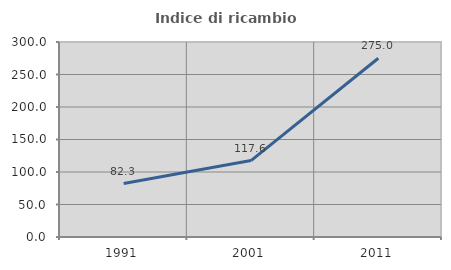
| Category | Indice di ricambio occupazionale  |
|---|---|
| 1991.0 | 82.278 |
| 2001.0 | 117.582 |
| 2011.0 | 275 |